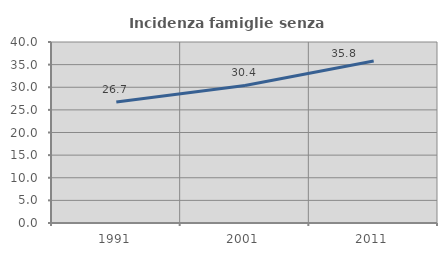
| Category | Incidenza famiglie senza nuclei |
|---|---|
| 1991.0 | 26.74 |
| 2001.0 | 30.408 |
| 2011.0 | 35.815 |